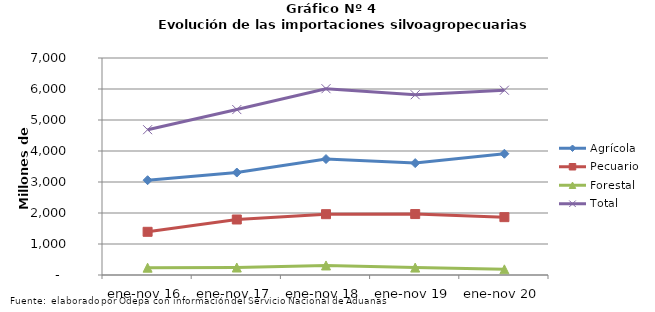
| Category | Agrícola | Pecuario | Forestal | Total |
|---|---|---|---|---|
| ene-nov 16 | 3057952 | 1393363 | 235879 | 4687194 |
| ene-nov 17 | 3305225 | 1790364 | 241068 | 5336657 |
| ene-nov 18 | 3740346 | 1961774 | 307528 | 6009648 |
| ene-nov 19 | 3609865 | 1965943 | 239178 | 5814986 |
| ene-nov 20 | 3911788 | 1866131 | 182836 | 5960755 |